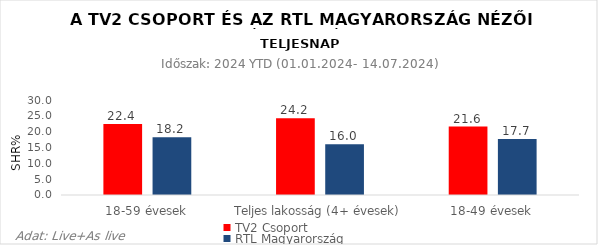
| Category | TV2 Csoport | RTL Magyarország |
|---|---|---|
| 18-59 évesek | 22.4 | 18.2 |
| Teljes lakosság (4+ évesek) | 24.2 | 16 |
| 18-49 évesek | 21.6 | 17.7 |